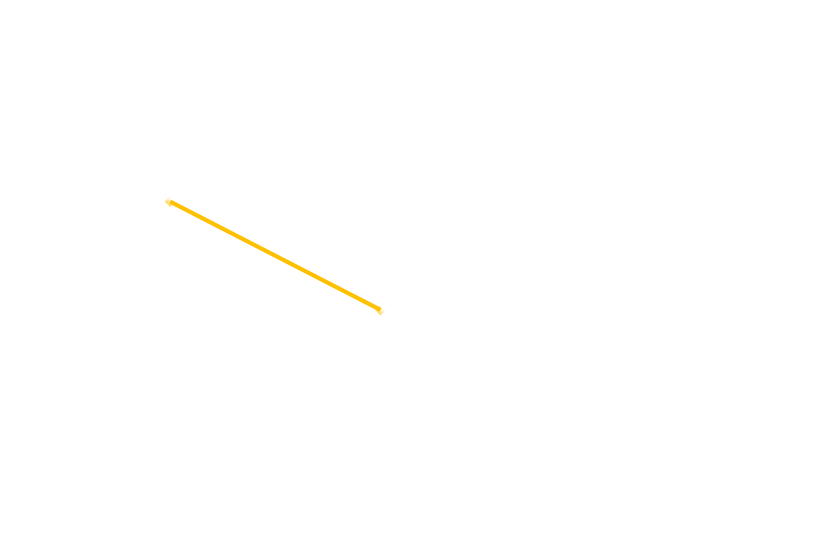
| Category | End |
|---|---|
| 0.4 | 1.15 |
| 1.15 | 1.95 |